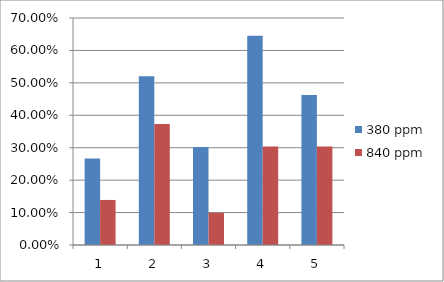
| Category | 380 ppm | 840 ppm |
|---|---|---|
| 0 | 0.267 | 0.139 |
| 1 | 0.52 | 0.373 |
| 2 | 0.302 | 0.099 |
| 3 | 0.645 | 0.304 |
| 4 | 0.463 | 0.304 |